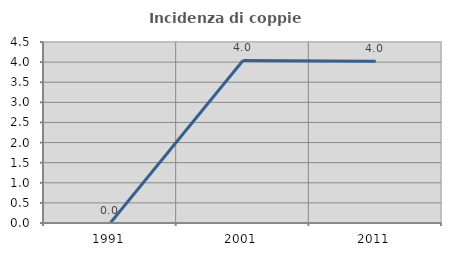
| Category | Incidenza di coppie miste |
|---|---|
| 1991.0 | 0 |
| 2001.0 | 4.04 |
| 2011.0 | 4.023 |